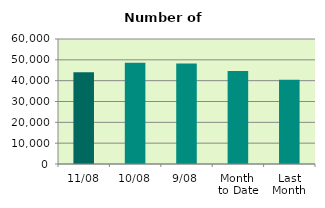
| Category | Series 0 |
|---|---|
| 11/08 | 44082 |
| 10/08 | 48628 |
| 9/08 | 48260 |
| Month 
to Date | 44627.778 |
| Last
Month | 40410.857 |